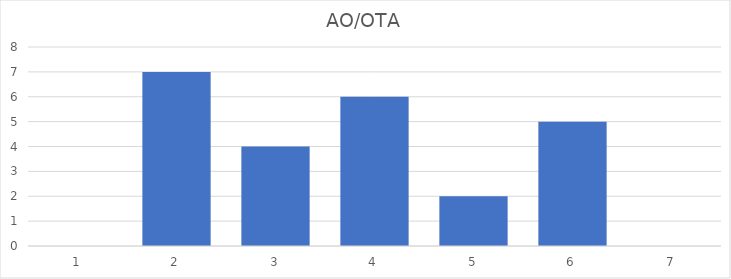
| Category | AO/OTA short |
|---|---|
| 0 | 0 |
| 1 | 0 |
| 2 | 3 |
| 3 | 5 |
| 4 | 7 |
| 5 | 5 |
| 6 | 4 |